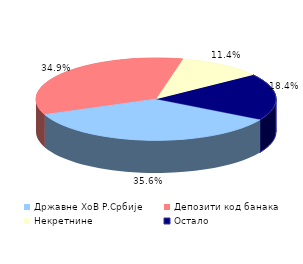
| Category | Series 0 |
|---|---|
| Државне ХоВ Р.Србије | 0.356 |
| Депозити код банака | 0.349 |
| Некретнине | 0.114 |
| Остало | 0.184 |